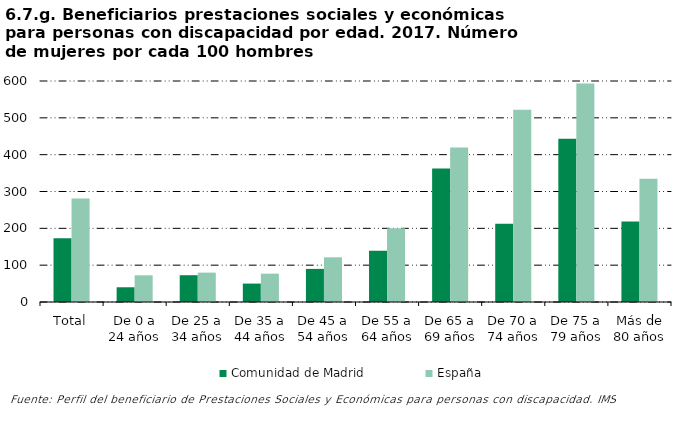
| Category | Comunidad de Madrid | España |
|---|---|---|
| Total | 172.889 | 280.858 |
| De 0 a 24 años | 40 | 72.358 |
| De 25 a 34 años | 72.727 | 79.769 |
| De 35 a 44 años | 50 | 77.027 |
| De 45 a 54 años | 89.873 | 121.325 |
| De 55 a 64 años | 139.175 | 200.176 |
| De 65 a 69 años | 362.5 | 419.617 |
| De 70 a 74 años | 212.195 | 521.905 |
| De 75 a 79 años | 443.478 | 593.396 |
| Más de 80 años | 218.644 | 334.814 |